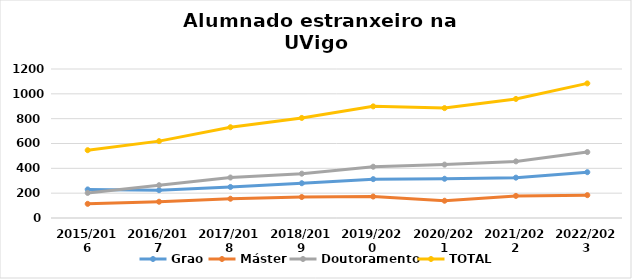
| Category | Grao | Máster | Doutoramento | TOTAL |
|---|---|---|---|---|
| 2015/2016 | 230 | 114 | 202 | 546 |
| 2016/2017 | 224 | 131 | 264 | 619 |
| 2017/2018 | 250 | 155 | 326 | 731 |
| 2018/2019 | 280 | 169 | 357 | 806 |
| 2019/2020 | 313 | 173 | 413 | 899 |
| 2020/2021 | 316 | 139 | 430 | 885 |
| 2021/2022 | 325 | 178 | 456 | 959 |
| 2022/2023 | 369 | 184 | 531 | 1084 |